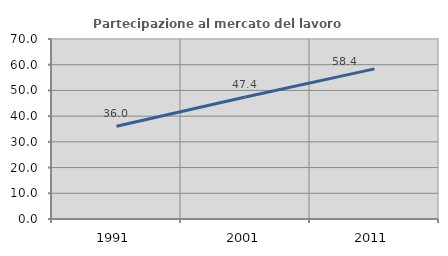
| Category | Partecipazione al mercato del lavoro  femminile |
|---|---|
| 1991.0 | 36.047 |
| 2001.0 | 47.416 |
| 2011.0 | 58.383 |